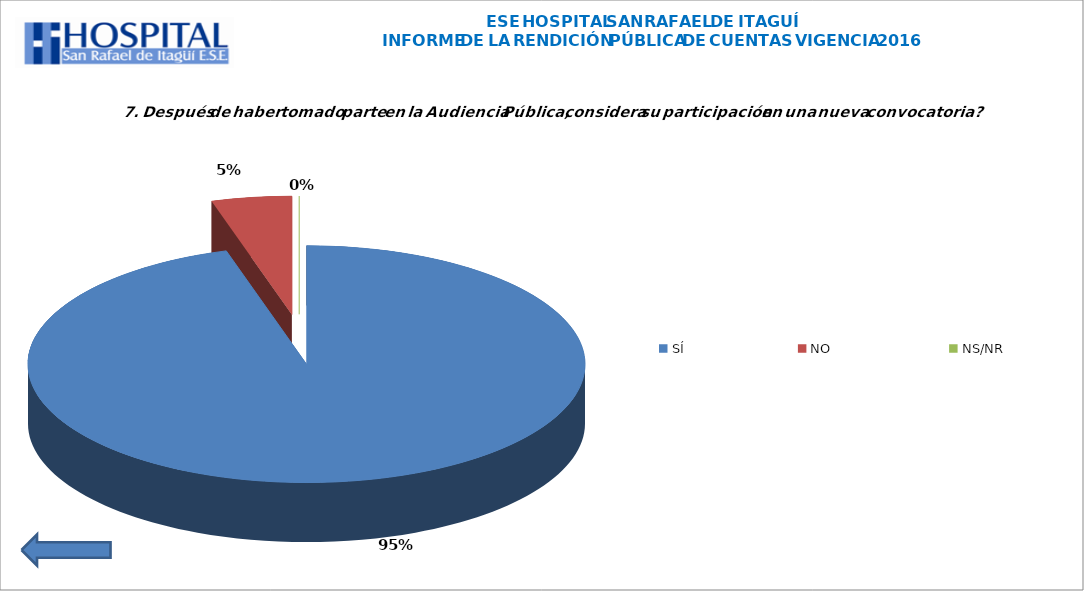
| Category | Series 0 |
|---|---|
| SÍ | 41 |
| NO  | 2 |
| NS/NR | 0 |